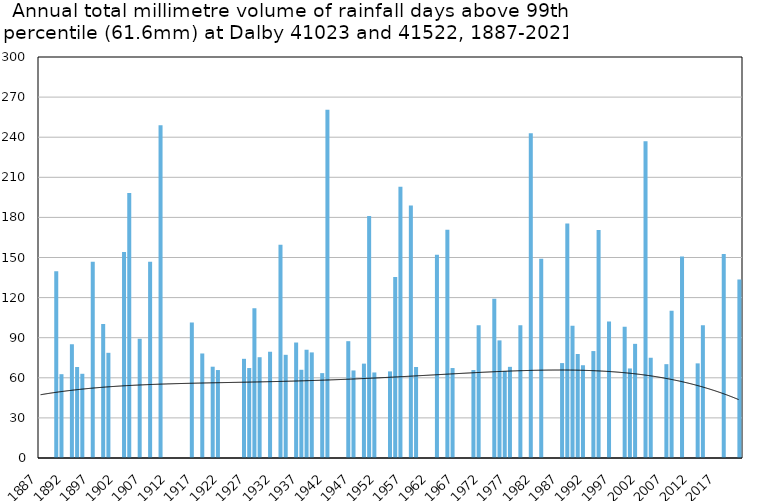
| Category | Annual total mm in days above 99th percentile |
|---|---|
| 1887 | 0 |
| 1888 | 0 |
| 1889 | 0 |
| 1890 | 139.7 |
| 1891 | 62.7 |
| 1892 | 0 |
| 1893 | 85.1 |
| 1894 | 68.1 |
| 1895 | 63 |
| 1896 | 0 |
| 1897 | 146.8 |
| 1898 | 0 |
| 1899 | 100.3 |
| 1900 | 78.7 |
| 1901 | 0 |
| 1902 | 0 |
| 1903 | 154.2 |
| 1904 | 198.3 |
| 1905 | 0 |
| 1906 | 89.2 |
| 1907 | 0 |
| 1908 | 146.8 |
| 1909 | 0 |
| 1910 | 249 |
| 1911 | 0 |
| 1912 | 0 |
| 1913 | 0 |
| 1914 | 0 |
| 1915 | 0 |
| 1916 | 101.3 |
| 1917 | 0 |
| 1918 | 78.2 |
| 1919 | 0 |
| 1920 | 68.3 |
| 1921 | 65.8 |
| 1922 | 0 |
| 1923 | 0 |
| 1924 | 0 |
| 1925 | 0 |
| 1926 | 74.2 |
| 1927 | 67.3 |
| 1928 | 112 |
| 1929 | 75.4 |
| 1930 | 0 |
| 1931 | 79.5 |
| 1932 | 0 |
| 1933 | 159.5 |
| 1934 | 77.2 |
| 1935 | 0 |
| 1936 | 86.4 |
| 1937 | 66 |
| 1938 | 81 |
| 1939 | 79 |
| 1940 | 0 |
| 1941 | 63.5 |
| 1942 | 260.6 |
| 1943 | 0 |
| 1944 | 0 |
| 1945 | 0 |
| 1946 | 87.4 |
| 1947 | 65.5 |
| 1948 | 0 |
| 1949 | 70.6 |
| 1950 | 181.1 |
| 1951 | 64 |
| 1952 | 0 |
| 1953 | 0 |
| 1954 | 64.8 |
| 1955 | 135.4 |
| 1956 | 203 |
| 1957 | 0 |
| 1958 | 188.9 |
| 1959 | 68.1 |
| 1960 | 0 |
| 1961 | 0 |
| 1962 | 0 |
| 1963 | 152.1 |
| 1964 | 0 |
| 1965 | 170.7 |
| 1966 | 67.3 |
| 1967 | 0 |
| 1968 | 0 |
| 1969 | 0 |
| 1970 | 65.8 |
| 1971 | 99.3 |
| 1972 | 0 |
| 1973 | 0 |
| 1974 | 119.2 |
| 1975 | 88 |
| 1976 | 65 |
| 1977 | 68.2 |
| 1978 | 0 |
| 1979 | 99.4 |
| 1980 | 0 |
| 1981 | 243 |
| 1982 | 0 |
| 1983 | 149 |
| 1984 | 0 |
| 1985 | 0 |
| 1986 | 0 |
| 1987 | 71 |
| 1988 | 175.4 |
| 1989 | 99 |
| 1990 | 77.8 |
| 1991 | 69.4 |
| 1992 | 0 |
| 1993 | 80 |
| 1994 | 170.6 |
| 1995 | 0 |
| 1996 | 102.2 |
| 1997 | 0 |
| 1998 | 0 |
| 1999 | 98.2 |
| 2000 | 67 |
| 2001 | 85.4 |
| 2002 | 0 |
| 2003 | 237 |
| 2004 | 75 |
| 2005 | 0 |
| 2006 | 0 |
| 2007 | 70.2 |
| 2008 | 110.2 |
| 2009 | 0 |
| 2010 | 150.8 |
| 2011 | 0 |
| 2012 | 0 |
| 2013 | 70.8 |
| 2014 | 99.4 |
| 2015 | 0 |
| 2016 | 0 |
| 2017 | 0 |
| 2018 | 152.6 |
| 2019 | 0 |
| 2020 | 0 |
| 2021 | 133.6 |